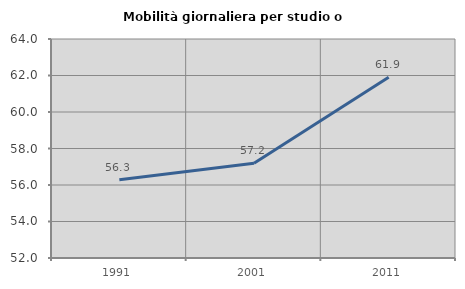
| Category | Mobilità giornaliera per studio o lavoro |
|---|---|
| 1991.0 | 56.283 |
| 2001.0 | 57.198 |
| 2011.0 | 61.909 |